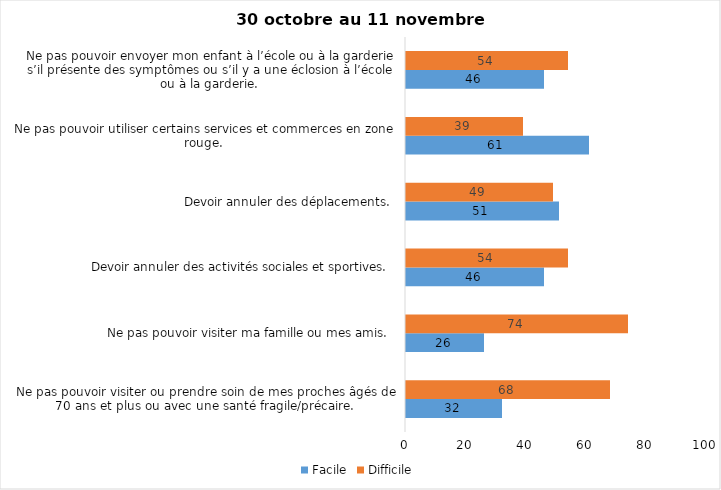
| Category | Facile | Difficile |
|---|---|---|
| Ne pas pouvoir visiter ou prendre soin de mes proches âgés de 70 ans et plus ou avec une santé fragile/précaire.  | 32 | 68 |
| Ne pas pouvoir visiter ma famille ou mes amis.  | 26 | 74 |
| Devoir annuler des activités sociales et sportives.  | 46 | 54 |
| Devoir annuler des déplacements.  | 51 | 49 |
| Ne pas pouvoir utiliser certains services et commerces en zone rouge.  | 61 | 39 |
| Ne pas pouvoir envoyer mon enfant à l’école ou à la garderie s’il présente des symptômes ou s’il y a une éclosion à l’école ou à la garderie.  | 46 | 54 |